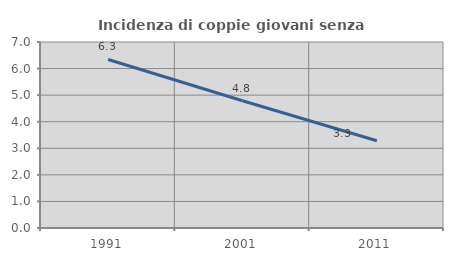
| Category | Incidenza di coppie giovani senza figli |
|---|---|
| 1991.0 | 6.343 |
| 2001.0 | 4.79 |
| 2011.0 | 3.285 |